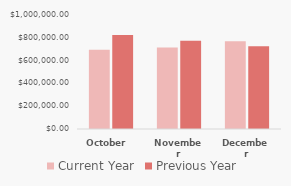
| Category | Current Year | Previous Year |
|---|---|---|
| October  | 695000 | 825000 |
| November | 715000 | 775000 |
| December | 770000 | 725000 |